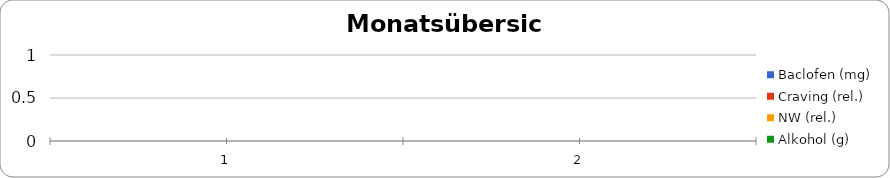
| Category | Baclofen (mg) | Craving (rel.) | NW (rel.) | Alkohol (g) |
|---|---|---|---|---|
| 0 | 0 | 0 | 0 | 0 |
| 1 | 0 | 0 | 0 | 0 |